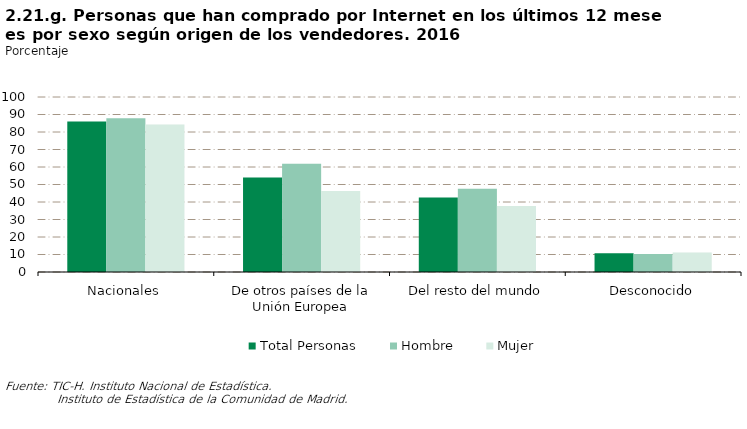
| Category | Total Personas | Hombre | Mujer |
|---|---|---|---|
| Nacionales | 86.009 | 87.813 | 84.227 |
| De otros países de la Unión Europea | 53.989 | 61.854 | 46.219 |
| Del resto del mundo | 42.636 | 47.631 | 37.703 |
| Desconocido | 10.698 | 10.293 | 11.097 |